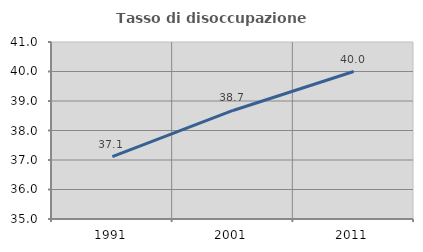
| Category | Tasso di disoccupazione giovanile  |
|---|---|
| 1991.0 | 37.113 |
| 2001.0 | 38.679 |
| 2011.0 | 40 |